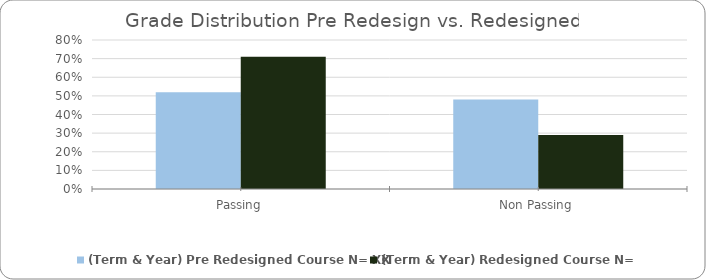
| Category | (Term & Year) Pre Redesigned Course N= XX | (Term & Year) Redesigned Course N=YY |
|---|---|---|
| Passing | 0.52 | 0.71 |
| Non Passing | 0.48 | 0.29 |